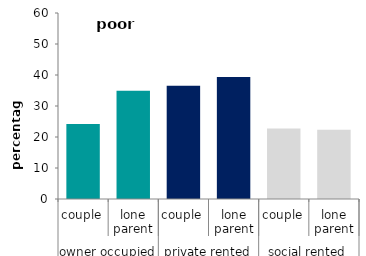
| Category | poor housing |
|---|---|
| 0 | 24.23 |
| 1 | 34.955 |
| 2 | 36.571 |
| 3 | 39.391 |
| 4 | 22.778 |
| 5 | 22.305 |